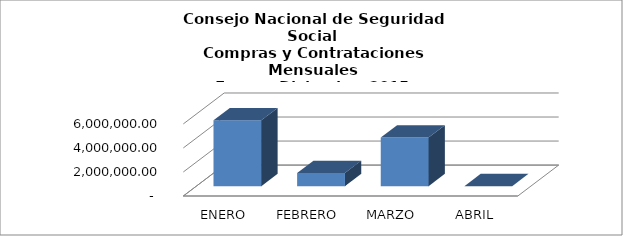
| Category | Series 0 |
|---|---|
| ENERO | 5482050.1 |
| FEBRERO | 1096863.94 |
| MARZO | 4050194.43 |
| ABRIL | 0 |